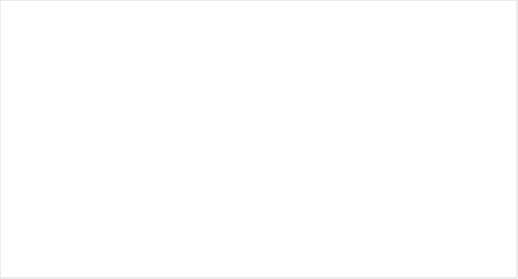
| Category | Average of  
Implied Return | Average of Alpha |
|---|---|---|
| High P/E | 0.015 | -0.008 |
| Medium P/E | 0.036 | 0.015 |
| Low P/E | -0.002 | -0.023 |